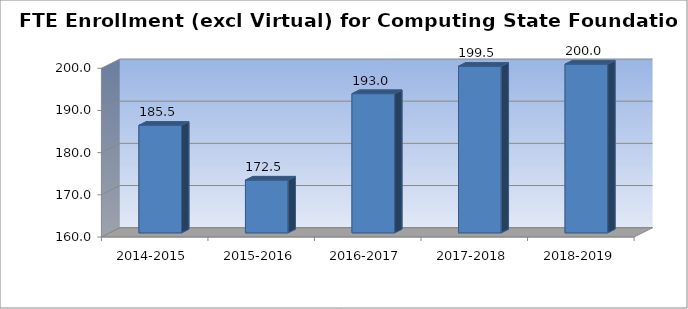
| Category | FTE Enrollment for Budget Authority |
|---|---|
| 2014-2015 | 185.5 |
| 2015-2016 | 172.5 |
| 2016-2017 | 193 |
| 2017-2018 | 199.5 |
| 2018-2019 | 200 |